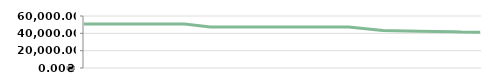
| Category | РІК   |
|---|---|
| 2013-04-23 | 50800 |
| 2013-04-25 | 50800 |
| 2013-05-07 | 50800 |
| 2013-05-14 | 50800 |
| 2013-05-14 | 50800 |
| 2013-05-29 | 50800 |
| 2013-06-10 | 50800 |
| 2013-06-21 | 50800 |
| 2013-07-06 | 47400 |
| 2013-08-05 | 47400 |
| 2013-08-19 | 47400 |
| 2013-09-04 | 47400 |
| 2013-09-20 | 47400 |
| 2013-09-25 | 47400 |
| 2013-10-15 | 43258.14 |
| 2013-11-05 | 42312.903 |
| 2013-11-26 | 41811.111 |
| 2013-11-30 | 41500 |
| 2013-12-11 | 41288.235 |